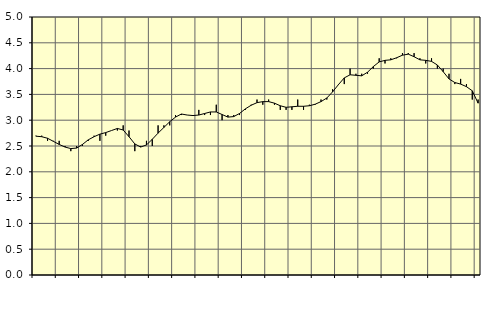
| Category | Piggar | Series 1 |
|---|---|---|
| nan | 2.7 | 2.69 |
| 1.0 | 2.7 | 2.68 |
| 1.0 | 2.6 | 2.65 |
| 1.0 | 2.6 | 2.59 |
| nan | 2.6 | 2.53 |
| 2.0 | 2.5 | 2.48 |
| 2.0 | 2.4 | 2.45 |
| 2.0 | 2.5 | 2.46 |
| nan | 2.5 | 2.53 |
| 3.0 | 2.6 | 2.62 |
| 3.0 | 2.7 | 2.68 |
| 3.0 | 2.6 | 2.73 |
| nan | 2.7 | 2.76 |
| 4.0 | 2.8 | 2.8 |
| 4.0 | 2.8 | 2.84 |
| 4.0 | 2.9 | 2.81 |
| nan | 2.8 | 2.68 |
| 5.0 | 2.4 | 2.54 |
| 5.0 | 2.5 | 2.48 |
| 5.0 | 2.6 | 2.52 |
| nan | 2.5 | 2.63 |
| 6.0 | 2.9 | 2.75 |
| 6.0 | 2.9 | 2.86 |
| 6.0 | 2.9 | 2.97 |
| nan | 3.1 | 3.06 |
| 7.0 | 3.1 | 3.12 |
| 7.0 | 3.1 | 3.1 |
| 7.0 | 3.1 | 3.09 |
| nan | 3.2 | 3.1 |
| 8.0 | 3.1 | 3.13 |
| 8.0 | 3.1 | 3.16 |
| 8.0 | 3.3 | 3.16 |
| nan | 3 | 3.11 |
| 9.0 | 3.1 | 3.06 |
| 9.0 | 3.1 | 3.07 |
| 9.0 | 3.1 | 3.13 |
| nan | 3.2 | 3.22 |
| 10.0 | 3.3 | 3.29 |
| 10.0 | 3.4 | 3.34 |
| 10.0 | 3.3 | 3.36 |
| nan | 3.4 | 3.36 |
| 11.0 | 3.3 | 3.33 |
| 11.0 | 3.2 | 3.28 |
| 11.0 | 3.2 | 3.25 |
| nan | 3.2 | 3.26 |
| 12.0 | 3.4 | 3.27 |
| 12.0 | 3.2 | 3.27 |
| 12.0 | 3.3 | 3.28 |
| nan | 3.3 | 3.31 |
| 13.0 | 3.4 | 3.36 |
| 13.0 | 3.4 | 3.43 |
| 13.0 | 3.6 | 3.55 |
| nan | 3.7 | 3.69 |
| 14.0 | 3.7 | 3.82 |
| 14.0 | 4 | 3.88 |
| 14.0 | 3.9 | 3.87 |
| nan | 3.9 | 3.86 |
| 15.0 | 3.9 | 3.93 |
| 15.0 | 4 | 4.04 |
| 15.0 | 4.2 | 4.13 |
| nan | 4.1 | 4.16 |
| 16.0 | 4.2 | 4.17 |
| 16.0 | 4.2 | 4.21 |
| 16.0 | 4.3 | 4.26 |
| nan | 4.3 | 4.28 |
| 17.0 | 4.3 | 4.23 |
| 17.0 | 4.2 | 4.17 |
| 17.0 | 4.1 | 4.16 |
| nan | 4.2 | 4.14 |
| 18.0 | 4 | 4.07 |
| 18.0 | 4 | 3.94 |
| 18.0 | 3.9 | 3.8 |
| nan | 3.7 | 3.73 |
| 19.0 | 3.8 | 3.7 |
| 19.0 | 3.7 | 3.65 |
| 19.0 | 3.4 | 3.57 |
| nan | 3.4 | 3.33 |